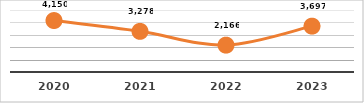
| Category | SERVICIOS TECNOLÓGICOS PROPORCIONADOS
PRIMER TRIMESTRE, EJERCICIO 2023 |
|---|---|
| 2020.0 | 4150 |
| 2021.0 | 3278 |
| 2022.0 | 2166 |
| 2023.0 | 3697 |